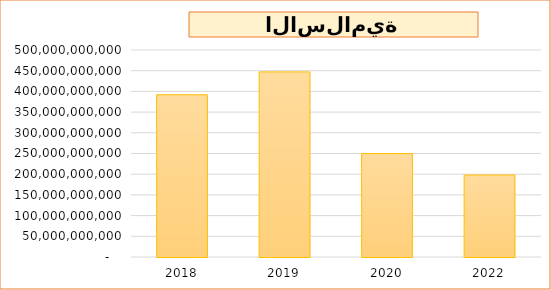
| Category | Series 0 | 2018 |
|---|---|---|
| 2018.0 | 391900000000 |  |
| 2019.0 | 447160000000 |  |
| 2020.0 | 249770000000 |  |
| 2022.0 | 198000000000 |  |